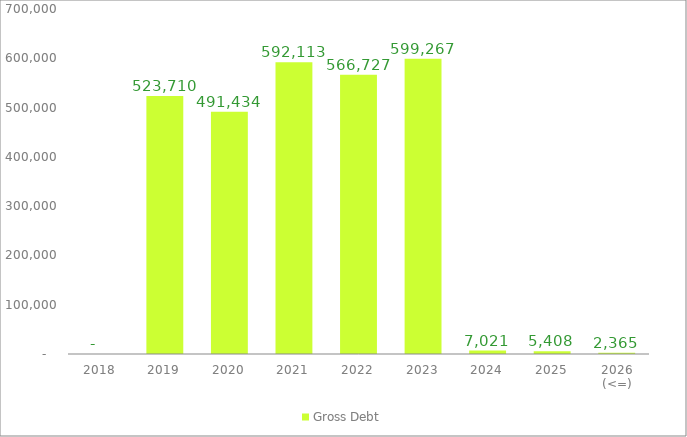
| Category | Gross Debt |
|---|---|
| 2018 | 0 |
| 2019 | 523709.941 |
| 2020 | 491434.393 |
| 2021 | 592113.4 |
| 2022 | 566726.592 |
| 2023 | 599267.127 |
| 2024 | 7021.369 |
| 2025 | 5407.91 |
| 2026 (<=) | 2364.721 |